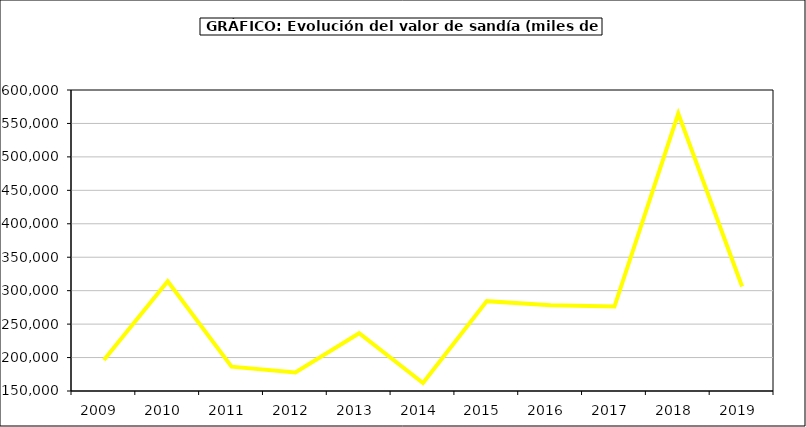
| Category | Valor |
|---|---|
| 2009.0 | 196465.666 |
| 2010.0 | 314067.402 |
| 2011.0 | 186441.033 |
| 2012.0 | 177750.096 |
| 2013.0 | 236329.828 |
| 2014.0 | 161950.328 |
| 2015.0 | 284357 |
| 2016.0 | 278370 |
| 2017.0 | 276294.254 |
| 2018.0 | 564662.077 |
| 2019.0 | 306143.724 |